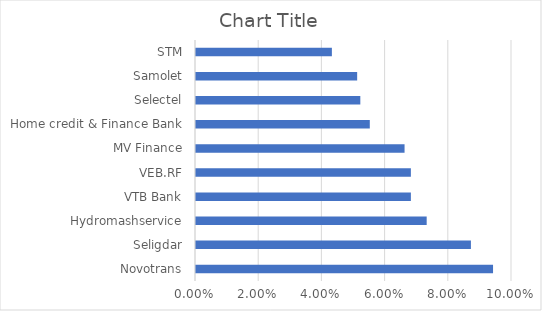
| Category | Series 0 |
|---|---|
| Novotrans | 0.094 |
| Seligdar | 0.087 |
| Hydromashservice | 0.073 |
| VTB Bank | 0.068 |
| VEB.RF | 0.068 |
| MV Finance | 0.066 |
| Home credit & Finance Bank | 0.055 |
| Selectel | 0.052 |
| Samolet | 0.051 |
| STM | 0.043 |